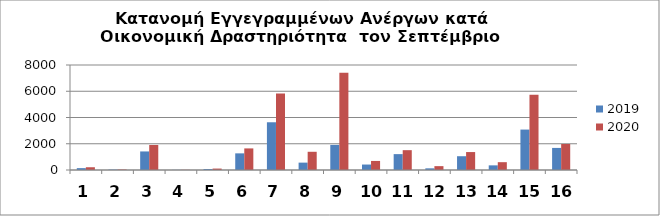
| Category | 2019 | 2020 |
|---|---|---|
| 0 | 142 | 210 |
| 1 | 31 | 37 |
| 2 | 1414 | 1908 |
| 3 | 10 | 13 |
| 4 | 74 | 109 |
| 5 | 1268 | 1645 |
| 6 | 3637 | 5829 |
| 7 | 562 | 1388 |
| 8 | 1911 | 7409 |
| 9 | 416 | 690 |
| 10 | 1210 | 1511 |
| 11 | 127 | 294 |
| 12 | 1050 | 1367 |
| 13 | 354 | 596 |
| 14 | 3080 | 5733 |
| 15 | 1682 | 1979 |